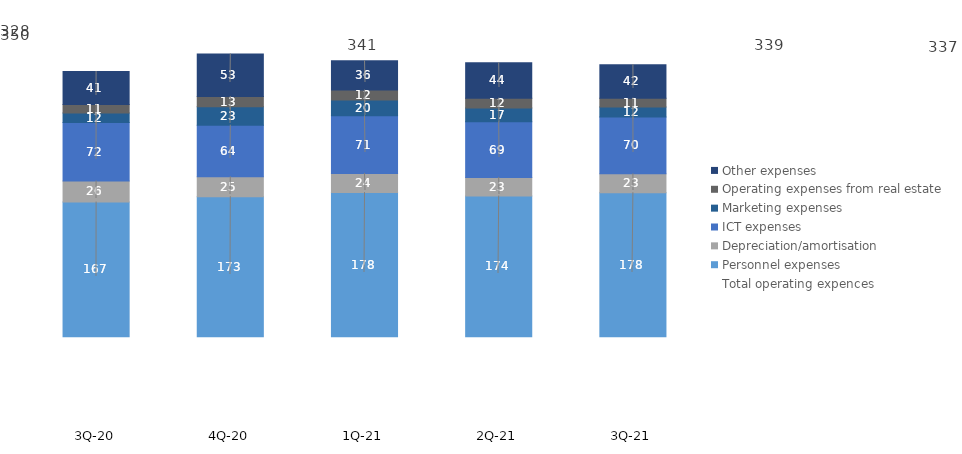
| Category | Personnel expenses | Depreciation/amortisation | ICT expenses | Marketing expenses | Operating expenses from real estate | Other expenses |
|---|---|---|---|---|---|---|
| 3Q-21 | 178.191 | 23.409 | 70.354 | 12.337 | 10.902 | 41.522 |
| 2Q-21 | 174.03 | 23.043 | 68.8 | 17.315 | 12.014 | 43.831 |
| 1Q-21 | 178.341 | 23.716 | 71.294 | 19.628 | 12.261 | 36.259 |
| 4Q-20 | 173.298 | 24.617 | 63.917 | 22.638 | 12.786 | 52.751 |
| 3Q-20 | 166.668 | 26.116 | 72.244 | 11.852 | 10.627 | 40.656 |